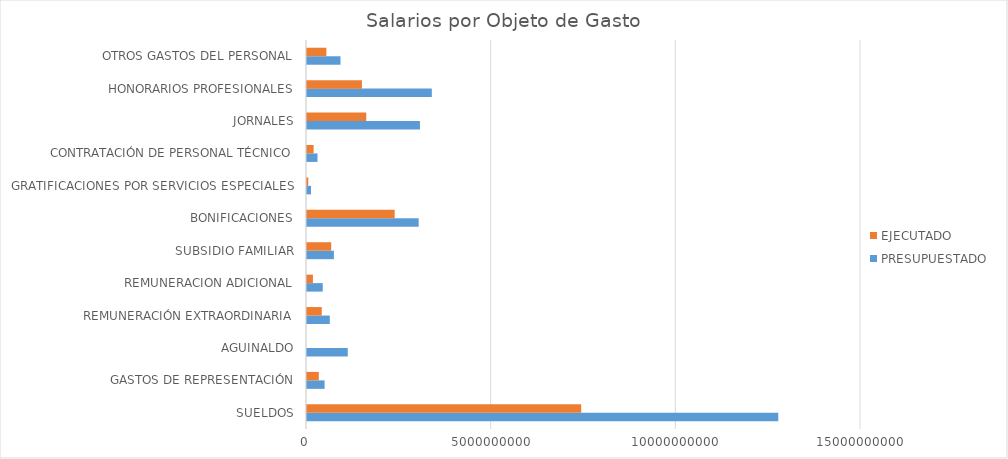
| Category | PRESUPUESTADO | EJECUTADO |
|---|---|---|
| SUELDOS | 12760347408 | 7423702188 |
| GASTOS DE REPRESENTACIÓN | 476214000 | 319283497 |
| AGUINALDO | 1103046784 | 0 |
| REMUNERACIÓN EXTRAORDINARIA | 617333416 | 398638447 |
| REMUNERACION ADICIONAL | 425863008 | 160406895 |
| SUBSIDIO FAMILIAR | 728300000 | 655278692 |
| BONIFICACIONES | 3024010080 | 2374079391 |
| GRATIFICACIONES POR SERVICIOS ESPECIALES | 108000000 | 34200000 |
| CONTRATACIÓN DE PERSONAL TÉCNICO | 284075000 | 178962444 |
| JORNALES | 3058157615 | 1604109293 |
| HONORARIOS PROFESIONALES | 3379469520 | 1486683031 |
| OTROS GASTOS DEL PERSONAL | 907314364 | 524325641 |